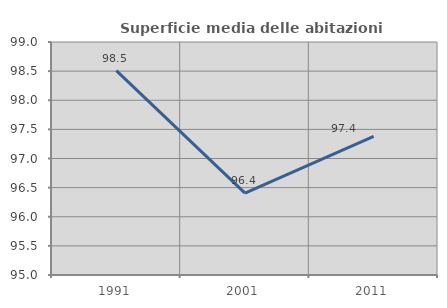
| Category | Superficie media delle abitazioni occupate |
|---|---|
| 1991.0 | 98.51 |
| 2001.0 | 96.404 |
| 2011.0 | 97.381 |